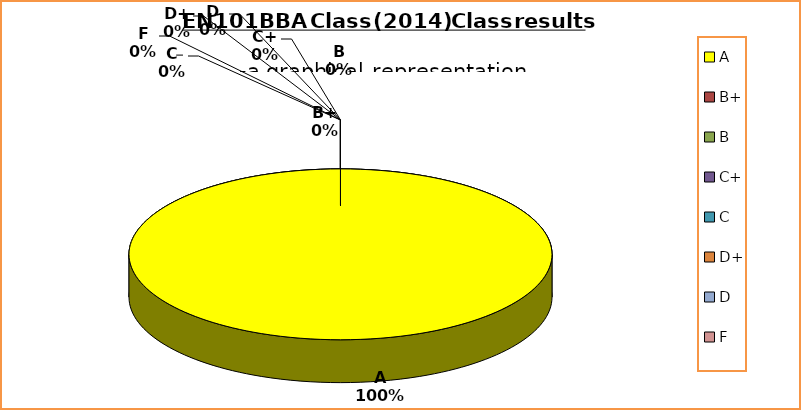
| Category | Series 0 |
|---|---|
| A | 3 |
| B+ | 0 |
| B | 0 |
| C+ | 0 |
| C | 0 |
| D+ | 0 |
| D | 0 |
| F | 0 |